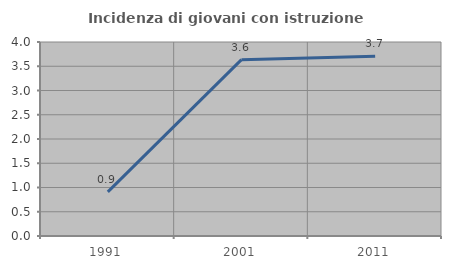
| Category | Incidenza di giovani con istruzione universitaria |
|---|---|
| 1991.0 | 0.909 |
| 2001.0 | 3.636 |
| 2011.0 | 3.704 |